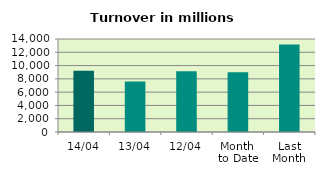
| Category | Series 0 |
|---|---|
| 14/04 | 9217.782 |
| 13/04 | 7602.285 |
| 12/04 | 9132.205 |
| Month 
to Date | 8980.374 |
| Last
Month | 13160.868 |